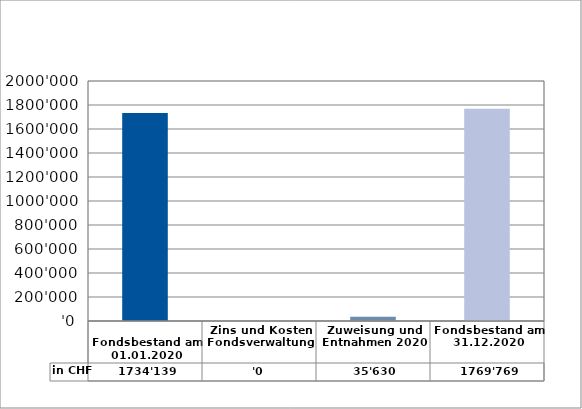
| Category | in CHF |
|---|---|
| 
Fondsbestand am 01.01.2020

 | 1734139 |
| Zins und Kosten Fondsverwaltung | 0 |
| Zuweisung und Entnahmen 2020 | 35629.75 |
| Fondsbestand am 31.12.2020 | 1769768.75 |